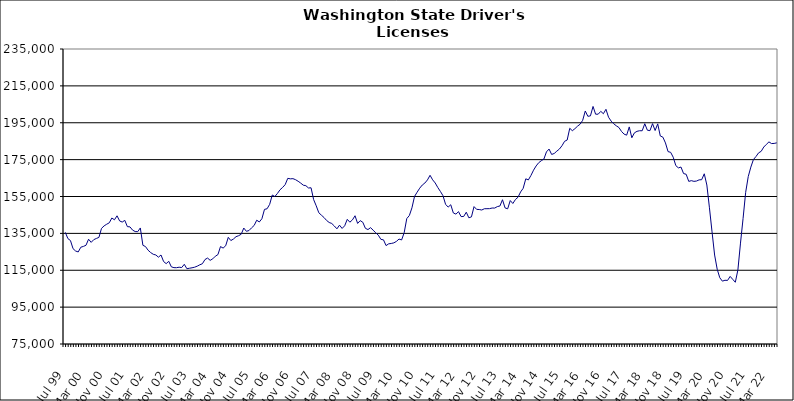
| Category | Series 0 |
|---|---|
| Jul 99 | 135560 |
| Aug 99 | 132182 |
| Sep 99 | 131104 |
| Oct 99 | 126694 |
| Nov 99 | 125425 |
| Dec 99 | 124927 |
| Jan 00 | 127499 |
| Feb 00 | 127927 |
| Mar 00 | 128547 |
| Apr 00 | 131834 |
| May 00 | 130120 |
| Jun 00 | 131595 |
| Jul 00 | 132236 |
| Aug 00 | 132819 |
| Sep 00 | 137711 |
| Oct 00 | 139063 |
| Nov 00 | 139952 |
| Dec 00 | 140732 |
| Jan 01 | 143338 |
| Feb 01 | 142359 |
| Mar 01 | 144523 |
| Apr 01 | 141758 |
| May 01 | 141135 |
| Jun 01 | 142064 |
| Jul 01 | 138646 |
| Aug 01 | 138530 |
| Sep 01 | 136784 |
| Oct 01 | 135996 |
| Nov 01 | 135917 |
| Dec 01 | 137940 |
| Jan 02 | 128531 |
| Feb 02 | 127848 |
| Mar 02 | 125876 |
| Apr 02 | 124595 |
| May 02 | 123660 |
| Jun 02 | 123282 |
| Jul 02 | 122089 |
| Aug 02 | 123279 |
| Sep 02 | 119727 |
| Oct 02 | 118588 |
| Nov 02 | 119854 |
| Dec 02 | 116851 |
| Jan 03 | 116407 |
| Feb 03 | 116382 |
| Mar 03 | 116648 |
| Apr 03 | 116471 |
| May 03 | 118231 |
| Jun 03 | 115831 |
| Jul 03 | 116082 |
| Aug 03 | 116341 |
| Sep 03 | 116653 |
| Oct 03 | 117212 |
| Nov 03 | 117962 |
| Dec 03 | 118542 |
| Jan 04 | 120817 |
| Feb 04 | 121617 |
| Mar 04 | 120369 |
| Apr 04 | 121200 |
| May 04 | 122609 |
| Jun 04 | 123484 |
| Jul 04 | 127844 |
| Aug 04 | 127025 |
| Sep 04 | 128273 |
| Oct 04 | 132853 |
| Nov 04 | 131106 |
| Dec 04 | 131935 |
| Jan 05 | 133205 |
| Feb 05 | 133736 |
| Mar 05 | 134528 |
| Apr 05 | 137889 |
| May 05 | 136130 |
| Jun 05 | 136523 |
| Jul 05 | 137997 |
| Aug 05 | 139294 |
| Sep 05 | 142140 |
| Oct 05 | 141192 |
| Nov 05 | 142937 |
| Dec 05 | 148013 |
| Jan 06 | 148341 |
| Feb 06 | 150744 |
| Mar 06 | 155794 |
| Apr 06 | 154984 |
| May 06 | 156651 |
| Jun 06 | 158638 |
| Jul 06 | 159911 |
| Aug 06 | 161445 |
| Sep 06 | 164852 |
| Oct 06 | 164570 |
| Nov 06 | 164679 |
| Dec 06 | 164127 |
| Jan 07 | 163271 |
| Feb 07 | 162273 |
| Mar 07 | 161140 |
| Apr 07 | 160860 |
| May 07 | 159633 |
| Jun 07 | 159724 |
| Jul 07 | 153303 |
| Aug 07 | 149939 |
| Sep 07 | 146172 |
| Oct 07 | 144876 |
| Nov 07 | 143613 |
| Dec 07 | 142022 |
| Jan 08 | 140909 |
| Feb 08 | 140368 |
| Mar 08 | 138998 |
| Apr 08 | 137471 |
| May 08 | 139453 |
| Jun 08 | 137680 |
| Jul 08 | 139120 |
| Aug 08 | 142612 |
| Sep-08 | 141071 |
| Oct 08 | 142313 |
| Nov 08 | 144556 |
| Dec 08 | 140394 |
| Jan 09 | 141903 |
| Feb 09 | 141036 |
| Mar 09 | 137751 |
| Apr 09 | 137060 |
| May 09 | 138101 |
| Jun 09 | 136739 |
| Jul 09 | 135317 |
| Aug 09 | 134020 |
| Sep 09 | 131756 |
| Oct 09 | 131488 |
| Nov 09 | 128370 |
| Dec 09 | 129323 |
| Jan 10 | 129531 |
| Feb 10 | 129848 |
| Mar 10 | 130654 |
| Apr 10 | 131929 |
| May 10 | 131429 |
| Jun 10 | 135357 |
| Jul 10 | 143032 |
| Aug 10 | 144686 |
| Sep 10 | 148856 |
| Oct 10 | 155042 |
| Nov 10 | 157328 |
| Dec 10 | 159501 |
| Jan 11 | 161221 |
| Feb 11 | 162312 |
| Mar 11 | 163996 |
| Apr 11 | 166495 |
| May 11 | 164040 |
| Jun 11 | 162324 |
| Jul 11 | 159862 |
| Aug 11 | 157738 |
| Sep 11 | 155430 |
| Oct 11 | 150762 |
| Nov 11 | 149255 |
| Dec 11 | 150533 |
| Jan 12 | 146068 |
| Feb 12 | 145446 |
| Mar 12 | 146788 |
| Apr 12 | 144110 |
| May 12 | 144162 |
| Jun 12 | 146482 |
| Jul 12 | 143445 |
| Aug 12 | 143950 |
| Sep 12 | 149520 |
| Oct 12 | 148033 |
| Nov 12 | 147926 |
| Dec 12 | 147674 |
| Jan 13 | 148360 |
| Feb-13 | 148388 |
| Mar-13 | 148414 |
| Apr 13 | 148749 |
| May 13 | 148735 |
| Jun-13 | 149521 |
| Jul 13 | 149837 |
| Aug 13 | 153252 |
| Sep 13 | 148803 |
| Oct 13 | 148315 |
| Nov 13 | 152804 |
| Dec 13 | 151209 |
| Jan 14 | 153357 |
| Feb-14 | 154608 |
| Mar 14 | 157479 |
| Apr 14 | 159441 |
| May 14 | 164591 |
| Jun 14 | 163995 |
| Jul-14 | 166411 |
| Aug-14 | 169272 |
| Sep 14 | 171565 |
| Oct 14 | 173335 |
| Nov 14 | 174406 |
| Dec 14 | 175302 |
| Jan 15 | 179204 |
| Feb 15 | 180737 |
| Mar 15 | 177810 |
| Apr-15 | 178331 |
| May 15 | 179601 |
| Jun-15 | 180729 |
| Jul 15 | 182540 |
| Aug 15 | 184924 |
| Sep 15 | 185620 |
| Oct 15 | 192002 |
| Nov 15 | 190681 |
| Dec 15 | 191795 |
| Jan 16 | 193132 |
| Feb 16 | 194206 |
| Mar 16 | 196319 |
| Apr 16 | 201373 |
| May 16 | 198500 |
| Jun 16 | 198743 |
| Jul 16 | 203841 |
| Aug 16 | 199630 |
| Sep 16 | 199655 |
| Oct 16 | 201181 |
| Nov 16 | 199888 |
| Dec 16 | 202304 |
| Jan 17 | 197977 |
| Feb 17 | 195889 |
| Mar 17 | 194438 |
| Apr 17 | 193335 |
| May 17 | 192430 |
| Jun 17 | 190298 |
| Jul 17 | 188832 |
| Aug 17 | 188264 |
| Sep 17 | 192738 |
| Oct 17 | 186856 |
| Nov 17 | 189537 |
| Dec 17 | 190341 |
| Jan 18 | 190670 |
| Feb 18 | 190645 |
| Mar 18 | 194476 |
| Apr 18 | 190971 |
| May 18 | 190707 |
| Jun 18 | 194516 |
| Jul 18 | 190783 |
| Aug 18 | 194390 |
| Sep 18 | 187831 |
| Oct 18 | 187188 |
| Nov 18 | 184054 |
| Dec 18 | 179347 |
| Jan 19 | 178958 |
| Feb 19 | 176289 |
| Mar 19 | 171747 |
| Apr 19 | 170532 |
| May 19 | 170967 |
| Jun 19 | 167444 |
| Jul 19 | 167059 |
| Aug 19 | 163194 |
| Sep 19 | 163599 |
| Oct 19 | 163212 |
| Nov 19 | 163388 |
| Dec 19 | 164024 |
| Jan 20 | 164114 |
| Feb 20 | 167320 |
| Mar 20 | 161221 |
| Apr 20 | 148866 |
| May 20 | 135821 |
| Jun 20 | 123252 |
| Jul 20 | 115526 |
| Aug 20 | 110940 |
| Sep 20 | 109099 |
| Oct 20 | 109566 |
| Nov 20 | 109488 |
| Dec 20 | 111658 |
| Jan 21 | 110070 |
| Feb 21 | 108491 |
| Mar 21 | 115176 |
| Apr 21 | 129726 |
| May 21 | 143052 |
| Jun 21 | 157253 |
| Jul 21 | 165832 |
| Aug 21 | 170937 |
| Sep 21 | 175042 |
| Oct 21 | 176696 |
| Nov 21 | 178677 |
| Dec 21 | 179501 |
| Jan 22 | 181825 |
| Feb 22 | 183258 |
| Mar 22 | 184618 |
| Apr 22 | 183710 |
| May 22 | 183784 |
| Jun 22 | 184101 |